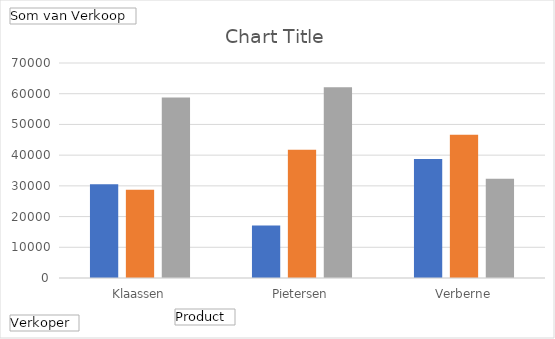
| Category | Dranken | Non-food | Vlees |
|---|---|---|---|
| Klaassen | 30522 | 28762 | 58746 |
| Pietersen | 17089 | 41766 | 62086 |
| Verberne | 38710 | 46607 | 32313 |